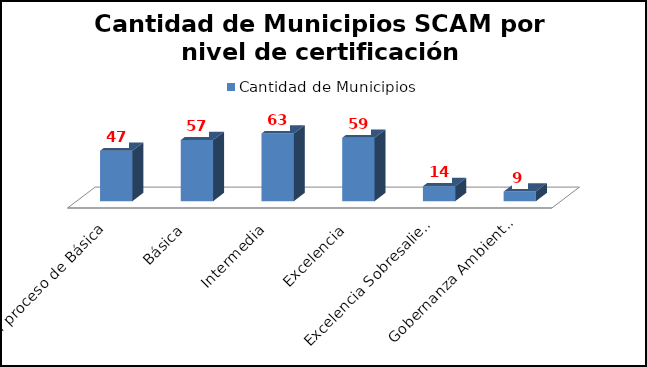
| Category | Cantidad de Municipios |
|---|---|
| En proceso de Básica | 47 |
| Básica | 57 |
| Intermedia | 63 |
| Excelencia | 59 |
| Excelencia Sobresaliente | 14 |
| Gobernanza Ambiental Climática | 9 |